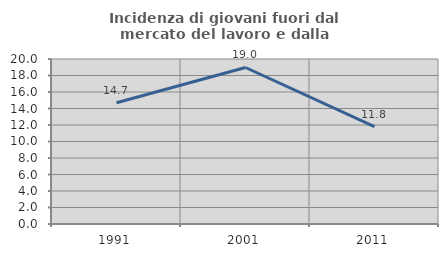
| Category | Incidenza di giovani fuori dal mercato del lavoro e dalla formazione  |
|---|---|
| 1991.0 | 14.701 |
| 2001.0 | 18.971 |
| 2011.0 | 11.804 |